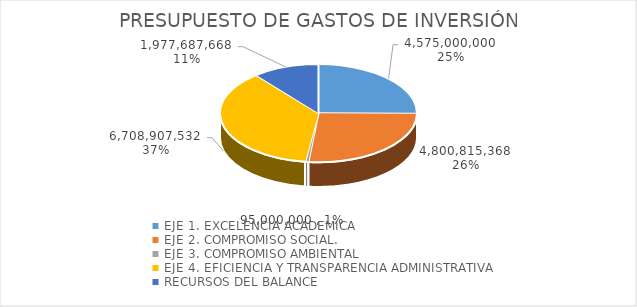
| Category | Series 0 |
|---|---|
| EJE 1. EXCELENCIA ACADEMICA | 4575000000 |
| EJE 2. COMPROMISO SOCIAL. | 4800815368 |
| EJE 3. COMPROMISO AMBIENTAL | 95000000 |
| EJE 4. EFICIENCIA Y TRANSPARENCIA ADMINISTRATIVA | 6708907532 |
| RECURSOS DEL BALANCE | 1977687668 |